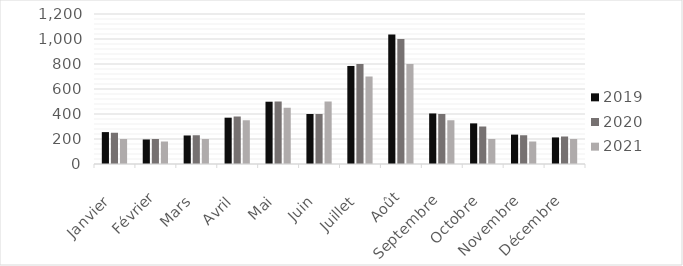
| Category | 2019 | 2020 | 2021 |
|---|---|---|---|
| Janvier | 255.19 | 250 | 200 |
| Février | 196.31 | 200 | 180 |
| Mars | 228.23 | 230 | 200 |
| Avril | 370.57 | 380 | 350 |
| Mai | 498.35 | 500 | 450 |
| Juin | 399.89 | 399.89 | 500 |
| Juillet | 784.35 | 800 | 700 |
| Août | 1035.1 | 1000 | 800 |
| Septembre | 404.42 | 400 | 350 |
| Octobre | 325 | 300 | 200 |
| Novembre | 235.06 | 230 | 180 |
| Décembre | 212.59 | 220 | 200 |